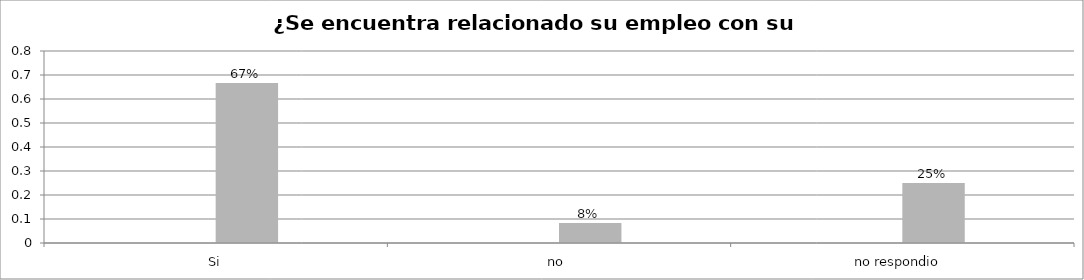
| Category | Series 0 | Series 1 | Series 2 | Series 3 |
|---|---|---|---|---|
| Si |  |  | 0.667 |  |
| no  |  |  | 0.083 |  |
| no respondio  |  |  | 0.25 |  |